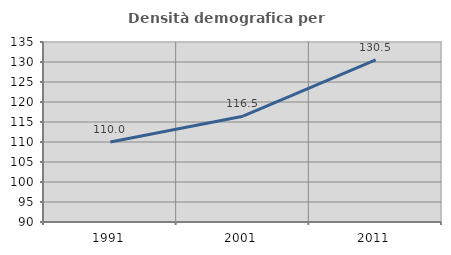
| Category | Densità demografica |
|---|---|
| 1991.0 | 109.982 |
| 2001.0 | 116.451 |
| 2011.0 | 130.545 |